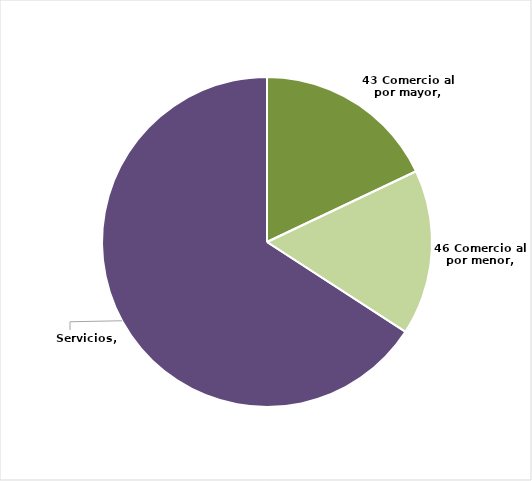
| Category | Series 0 |
|---|---|
| 43 Comercio al por mayor | 0.179 |
| 46 Comercio al por menor | 0.162 |
| Servicios | 0.658 |